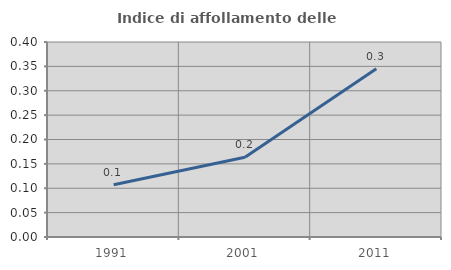
| Category | Indice di affollamento delle abitazioni  |
|---|---|
| 1991.0 | 0.107 |
| 2001.0 | 0.164 |
| 2011.0 | 0.345 |